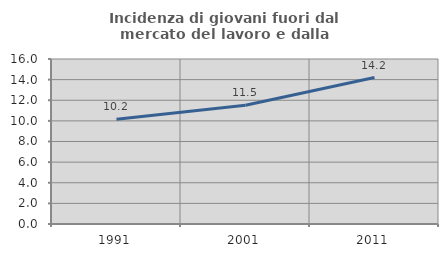
| Category | Incidenza di giovani fuori dal mercato del lavoro e dalla formazione  |
|---|---|
| 1991.0 | 10.152 |
| 2001.0 | 11.509 |
| 2011.0 | 14.202 |